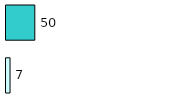
| Category | Series 0 | Series 1 |
|---|---|---|
| 0 | 7 | 50 |